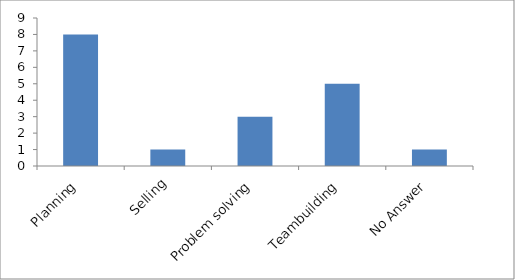
| Category | What specific learnings from the social entrepreneurship program contribute most to young people? |
|---|---|
| Planning | 8 |
| Selling | 1 |
| Problem solving  | 3 |
| Teambuilding | 5 |
| No Answer | 1 |